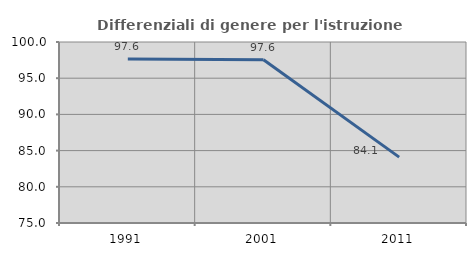
| Category | Differenziali di genere per l'istruzione superiore |
|---|---|
| 1991.0 | 97.635 |
| 2001.0 | 97.558 |
| 2011.0 | 84.101 |